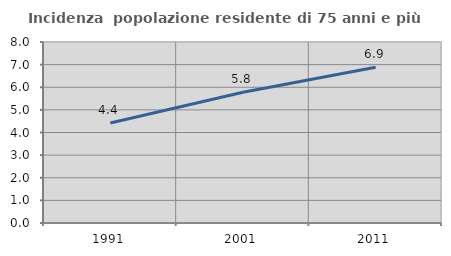
| Category | Incidenza  popolazione residente di 75 anni e più |
|---|---|
| 1991.0 | 4.419 |
| 2001.0 | 5.776 |
| 2011.0 | 6.881 |